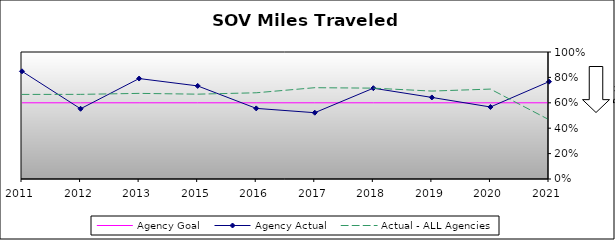
| Category | Agency Goal | Agency Actual | Actual - ALL Agencies |
|---|---|---|---|
| 2011.0 | 0.6 | 0.848 | 0.666 |
| 2012.0 | 0.6 | 0.553 | 0.666 |
| 2013.0 | 0.6 | 0.791 | 0.674 |
| 2015.0 | 0.6 | 0.733 | 0.668 |
| 2016.0 | 0.6 | 0.556 | 0.679 |
| 2017.0 | 0.6 | 0.522 | 0.719 |
| 2018.0 | 0.6 | 0.715 | 0.715 |
| 2019.0 | 0.6 | 0.642 | 0.692 |
| 2020.0 | 0.6 | 0.567 | 0.708 |
| 2021.0 | 0.6 | 0.766 | 0.467 |